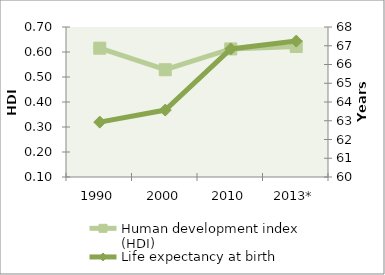
| Category | Human development index (HDI) |
|---|---|
| 1990 | 0.615 |
| 2000 | 0.529 |
| 2010 | 0.612 |
| 2013* | 0.622 |